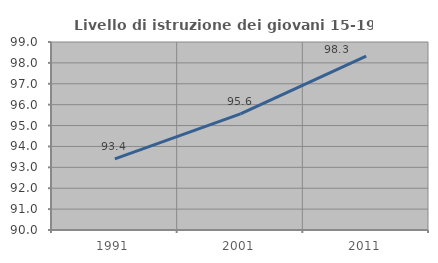
| Category | Livello di istruzione dei giovani 15-19 anni |
|---|---|
| 1991.0 | 93.403 |
| 2001.0 | 95.556 |
| 2011.0 | 98.329 |